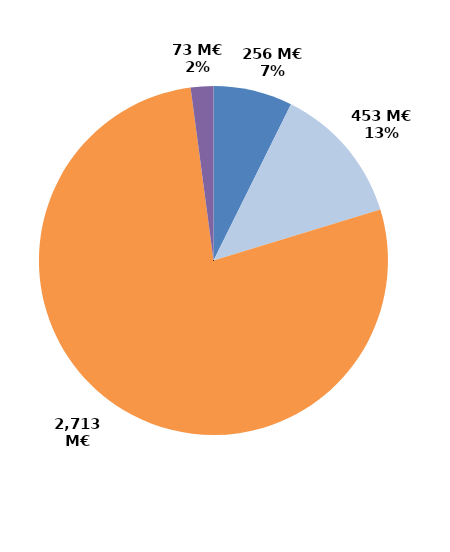
| Category | Series 0 |
|---|---|
| CIF - CPF | 256.018 |
| Période de professionnalisation | 453.016 |
| Plan de formation | 2713.057 |
| Autres | 73.365 |